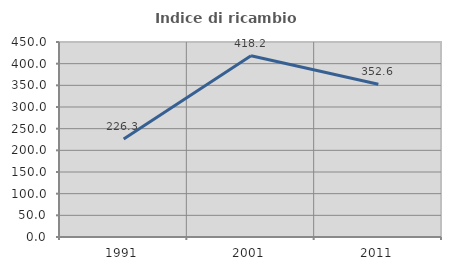
| Category | Indice di ricambio occupazionale  |
|---|---|
| 1991.0 | 226.316 |
| 2001.0 | 418.182 |
| 2011.0 | 352.632 |